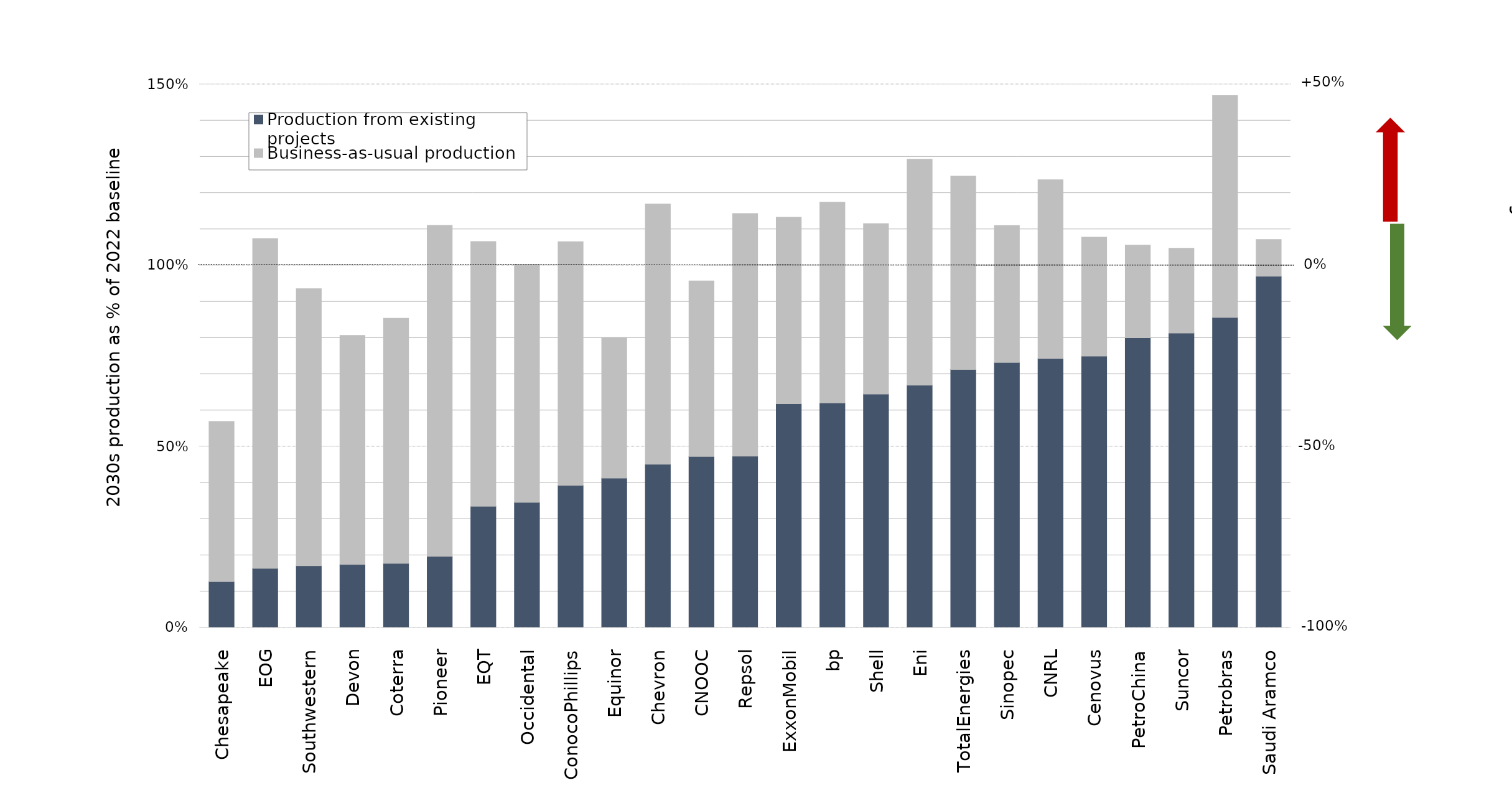
| Category | Production from existing projects | Business-as-usual production  |
|---|---|---|
| Chesapeake | 0.127 | 0.442 |
| EOG | 0.164 | 0.91 |
| Southwestern | 0.171 | 0.765 |
| Devon | 0.175 | 0.632 |
| Coterra | 0.178 | 0.677 |
| Pioneer | 0.197 | 0.914 |
| EQT | 0.336 | 0.73 |
| Occidental | 0.346 | 0.657 |
| ConocoPhillips | 0.393 | 0.673 |
| Equinor | 0.413 | 0.388 |
| Chevron | 0.451 | 0.718 |
| CNOOC | 0.473 | 0.484 |
| Repsol | 0.474 | 0.67 |
| ExxonMobil | 0.619 | 0.515 |
| bp | 0.621 | 0.554 |
| Shell | 0.645 | 0.471 |
| Eni | 0.67 | 0.624 |
| TotalEnergies | 0.713 | 0.534 |
| Sinopec | 0.733 | 0.378 |
| CNRL | 0.743 | 0.493 |
| Cenovus | 0.75 | 0.328 |
| PetroChina | 0.8 | 0.256 |
| Suncor | 0.814 | 0.234 |
| Petrobras | 0.857 | 0.612 |
| Saudi Aramco | 0.97 | 0.102 |